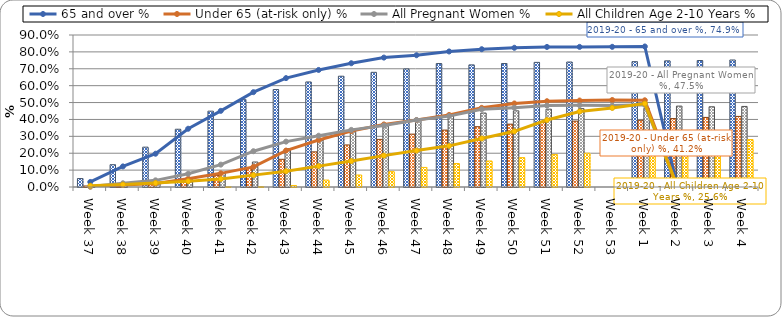
| Category | 2019-20 - 65 and over % | 2019-20 - Under 65 (at-risk only) % | 2019-20 - All Pregnant Women % | 2019-20 - All Children Age 2-10 Years % |
|---|---|---|---|---|
| Week 37 | 0.05 | 0.006 | 0.005 | 0 |
| Week 38 | 0.132 | 0.002 | 0.01 | 0 |
| Week 39 | 0.236 | 0.026 | 0.027 | 0 |
| Week 40 | 0.342 | 0.04 | 0.046 | 0 |
| Week 41 | 0.449 | 0.069 | 0.086 | 0.001 |
| Week 42 | 0.517 | 0.111 | 0.148 | 0.002 |
| Week 43 | 0.577 | 0.164 | 0.227 | 0.009 |
| Week 44 | 0.622 | 0.208 | 0.278 | 0.041 |
| Week 45 | 0.656 | 0.249 | 0.33 | 0.071 |
| Week 46 | 0.679 | 0.282 | 0.369 | 0.091 |
| Week 47 | 0.699 | 0.313 | 0.398 | 0.116 |
| Week 48 | 0.731 | 0.337 | 0.424 | 0.139 |
| Week 49 | 0.723 | 0.357 | 0.438 | 0.154 |
| Week 50 | 0.731 | 0.372 | 0.451 | 0.174 |
| Week 51 | 0.738 | 0.385 | 0.461 | 0.192 |
| Week 52 | 0.74 | 0.39 | 0.464 | 0.2 |
| Week 53 | 0 | 0 | 0 | 0 |
| Week 1 | 0.742 | 0.395 | 0.466 | 0.212 |
| Week 2 | 0.747 | 0.405 | 0.479 | 0.237 |
| Week 3 | 0.749 | 0.412 | 0.475 | 0.256 |
| Week 4 | 0.752 | 0.418 | 0.477 | 0.281 |